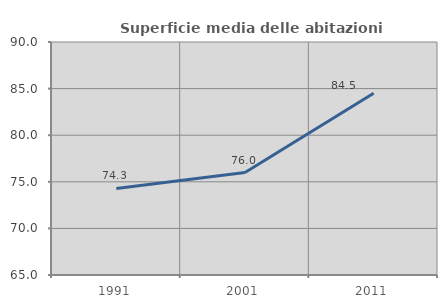
| Category | Superficie media delle abitazioni occupate |
|---|---|
| 1991.0 | 74.284 |
| 2001.0 | 75.988 |
| 2011.0 | 84.5 |